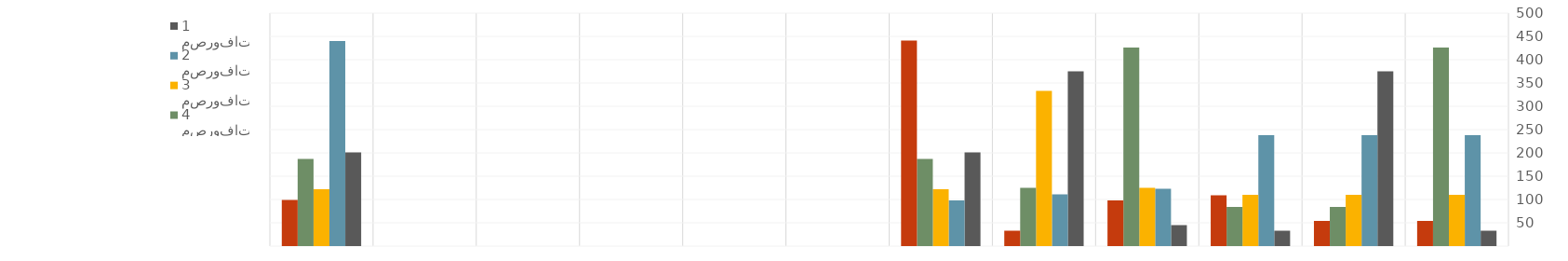
| Category | مصروفات 1 | مصروفات 2 | مصروفات 3 | مصروفات 4 | مصروفات 5 |
|---|---|---|---|---|---|
| يناير | 33 | 238 | 110 | 426 | 54 |
| فبراير | 375 | 238 | 110 | 84 | 54 |
| مارس | 33 | 238 | 110 | 84 | 109 |
| أبريل | 45 | 123 | 125 | 426 | 98 |
| مايو | 375 | 111 | 333 | 125 | 33 |
| يونيو | 201 | 98 | 122 | 187 | 441 |
| يوليو | 0 | 0 | 0 | 0 | 0 |
| أغسطس | 0 | 0 | 0 | 0 | 0 |
| سبتمبر | 0 | 0 | 0 | 0 | 0 |
| أكتوبر | 0 | 0 | 0 | 0 | 0 |
| نوفمبر | 0 | 0 | 0 | 0 | 0 |
| ديسمبر | 201 | 440 | 122 | 187 | 99 |